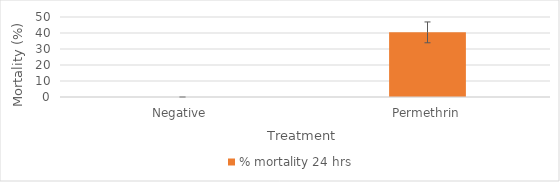
| Category | % mortality 24 hrs |
|---|---|
| Negative  | 0 |
| Permethrin | 40.404 |